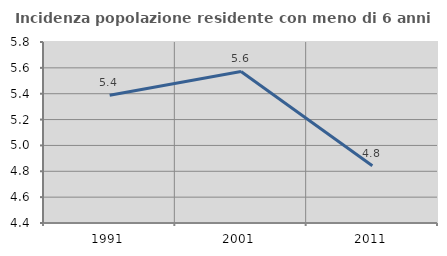
| Category | Incidenza popolazione residente con meno di 6 anni |
|---|---|
| 1991.0 | 5.389 |
| 2001.0 | 5.572 |
| 2011.0 | 4.843 |